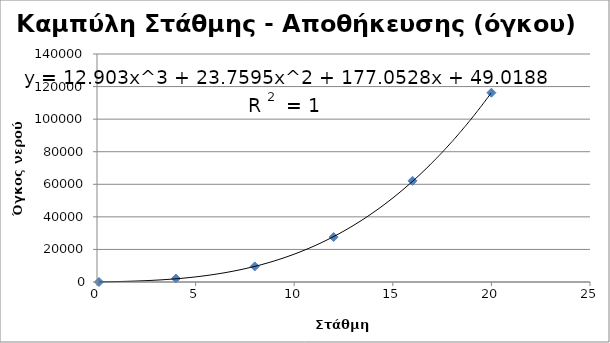
| Category | Series 0 |
|---|---|
| 0.1 | 1 |
| 4.0 | 2128 |
| 8.0 | 9580 |
| 12.0 | 27592 |
| 16.0 | 62120 |
| 20.0 | 116226 |